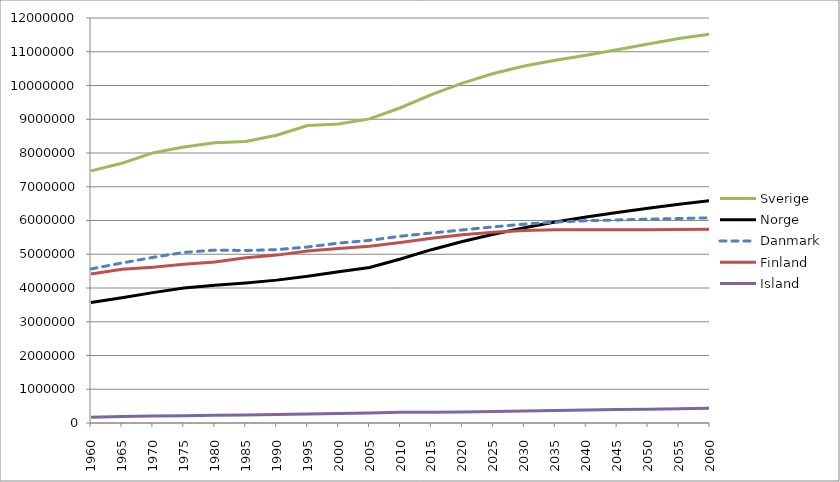
| Category | Sverige | Norge | Danmark | Finland | Island |
|---|---|---|---|---|---|
| 1960 | 7471345 | 3567707 | 4565455 | 4413046 | 173855 |
| 1965 | 7695200 | 3708609 | 4741008 | 4557567 | 190652 |
| 1970 | 8004371 | 3863221 | 4906916 | 4614277 | 204042 |
| 1975 | 8176447 | 3997525 | 5054410 | 4702387 | 216695 |
| 1980 | 8303094 | 4078900 | 5122065 | 4771292 | 226948 |
| 1985 | 8342633 | 4145845 | 5111108 | 4893748 | 240606 |
| 1990 | 8527039 | 4233116 | 5135409 | 4974383 | 253785 |
| 1995 | 8816381 | 4348410 | 5215718 | 5098754 | 266978 |
| 2000 | 8861426 | 4478497 | 5330020 | 5171302 | 279049 |
| 2005 | 9011392 | 4606363 | 5411405 | 5236611 | 293577 |
| 2010 | 9340682 | 4858199 | 5534738 | 5351427 | 317630 |
| 2015 | 9732212 | 5135483 | 5629468 | 5474652 | 315317 |
| 2020 | 10071521 | 5379920 | 5720332 | 5577269 | 323431 |
| 2025 | 10354529 | 5594156 | 5811158 | 5654603 | 339222 |
| 2030 | 10577959 | 5787755 | 5892997 | 5704485 | 355091 |
| 2035 | 10745871 | 5954599 | 5953827 | 5725434 | 370341 |
| 2040 | 10898366 | 6101189 | 5991954 | 5727038 | 384557 |
| 2045 | 11060433 | 6237169 | 6017076 | 5724041 | 397633 |
| 2050 | 11231198 | 6365895 | 6037836 | 5726934 | 409941 |
| 2055 | 11391111 | 6483438 | 6057758 | 5733912 | 422219 |
| 2060 | 11525240 | 6587061 | 6079838 | 5744452 | 435030 |